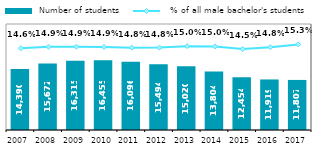
| Category |  Number of students |
|---|---|
| 2007.0 | 14390 |
| 2008.0 | 15672 |
| 2009.0 | 16315 |
| 2010.0 | 16455 |
| 2011.0 | 16096 |
| 2012.0 | 15494 |
| 2013.0 | 15020 |
| 2014.0 | 13804 |
| 2015.0 | 12454 |
| 2016.0 | 11919 |
| 2017.0 | 11807 |